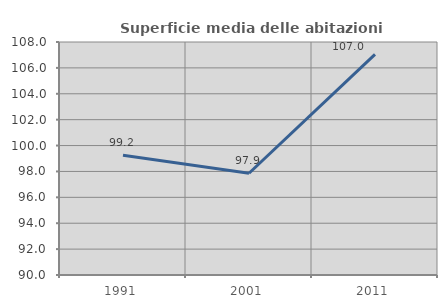
| Category | Superficie media delle abitazioni occupate |
|---|---|
| 1991.0 | 99.245 |
| 2001.0 | 97.859 |
| 2011.0 | 107.043 |